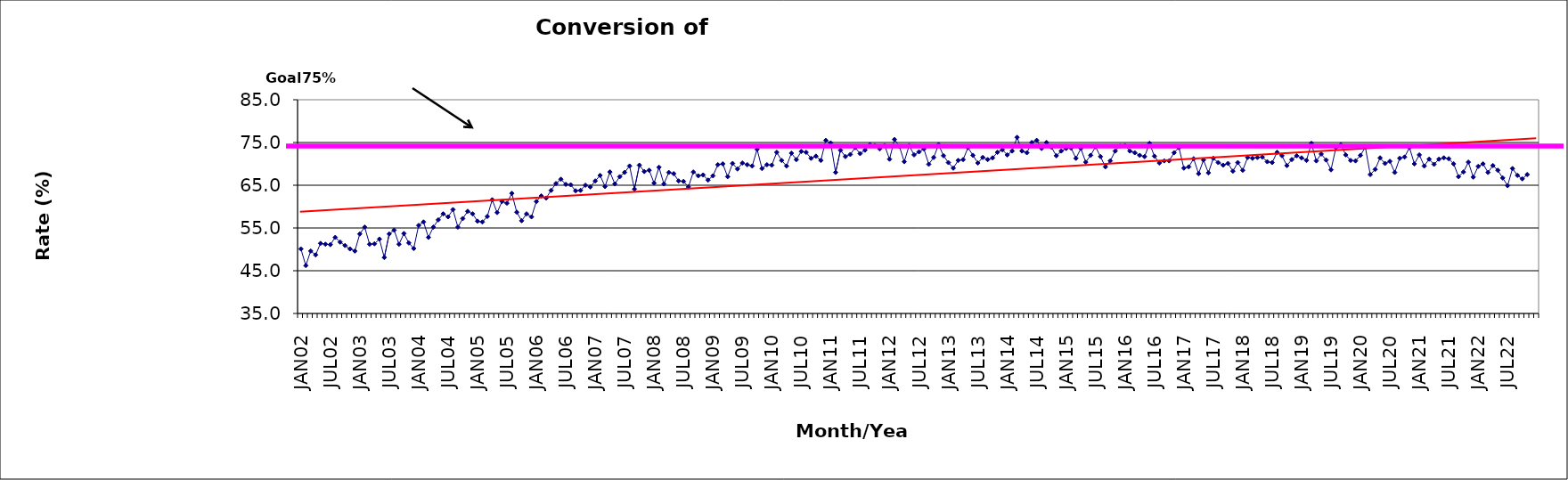
| Category | Series 0 |
|---|---|
| JAN02 | 50.1 |
| FEB02 | 46.2 |
| MAR02 | 49.6 |
| APR02 | 48.7 |
| MAY02 | 51.4 |
| JUN02 | 51.2 |
| JUL02 | 51.1 |
| AUG02 | 52.8 |
| SEP02 | 51.7 |
| OCT02 | 50.9 |
| NOV02 | 50.1 |
| DEC02 | 49.6 |
| JAN03 | 53.6 |
| FEB03 | 55.2 |
| MAR03 | 51.2 |
| APR03 | 51.3 |
| MAY03 | 52.4 |
| JUN03 | 48.1 |
| JUL03 | 53.6 |
| AUG03 | 54.5 |
| SEP03 | 51.2 |
| OCT03 | 53.7 |
| NOV03 | 51.5 |
| DEC03 | 50.2 |
| JAN04 | 55.6 |
| FEB04 | 56.4 |
| MAR04 | 52.8 |
| APR04 | 55.2 |
| MAY04 | 56.9 |
| JUN04 | 58.3 |
| JUL04 | 57.6 |
| AUG04 | 59.3 |
| SEP04 | 55.2 |
| OCT04 | 57.2 |
| NOV04 | 58.9 |
| DEC04 | 58.3 |
| JAN05 | 56.6 |
| FEB05 | 56.4 |
| MAR05 | 57.7 |
| APR05 | 61.6 |
| MAY05 | 58.6 |
| JUN05 | 61.2 |
| JUL05 | 60.8 |
| AUG05 | 63.1 |
| SEP05 | 58.7 |
| OCT05 | 56.7 |
| NOV05 | 58.3 |
| DEC05 | 57.6 |
| JAN06 | 61.2 |
| FEB06 | 62.5 |
| MAR06 | 62 |
| APR06 | 63.8 |
| MAY06 | 65.4 |
| JUN06 | 66.4 |
| JUL06 | 65.2 |
| AUG06 | 65.1 |
| SEP06 | 63.7 |
| OCT06 | 63.8 |
| NOV06 | 65 |
| DEC06 | 64.6 |
| JAN07 | 66 |
| FEB07 | 67.3 |
| MAR07 | 64.7 |
| APR07 | 68.1 |
| MAY07 | 65.3 |
| JUN07 | 67 |
| JUL07 | 68 |
| AUG07 | 69.5 |
| SEP07 | 64.1 |
| OCT07 | 69.7 |
| NOV07 | 68.2 |
| DEC07 | 68.5 |
| JAN08 | 65.5 |
| FEB08 | 69.2 |
| MAR08 | 65.3 |
| APR08 | 68 |
| MAY08 | 67.7 |
| JUN08 | 66 |
| JUL08 | 65.9 |
| AUG08 | 64.6 |
| SEP08 | 68.1 |
| OCT08 | 67.2 |
| NOV08 | 67.4 |
| DEC08 | 66.2 |
| JAN09 | 67.2 |
| FEB09 | 69.8 |
| MAR09 | 70 |
| APR09 | 67 |
| MAY09 | 70.1 |
| JUN09 | 68.8 |
| JUL09 | 70.2 |
| AUG09 | 69.8 |
| SEP09 | 69.5 |
| OCT09 | 73.4 |
| NOV09 | 68.9 |
| DEC09 | 69.8 |
| JAN10 | 69.7 |
| FEB10 | 72.7 |
| MAR10 | 70.8 |
| APR10 | 69.5 |
| MAY10 | 72.5 |
| JUN10 | 71 |
| JUL10 | 72.9 |
| AUG10 | 72.7 |
| SEP10 | 71.3 |
| OCT10 | 71.8 |
| NOV10 | 70.8 |
| DEC10 | 75.5 |
| JAN11 | 74.9 |
| FEB11 | 68 |
| MAR11 | 73.2 |
| APR11 | 71.7 |
| MAY11 | 72.2 |
| JUN11 | 73.8 |
| JUL11 | 72.4 |
| AUG11 | 73.2 |
| SEP11 | 74.5 |
| OCT11 | 74.3 |
| NOV11 | 73.5 |
| DEC11 | 74.3 |
| JAN12 | 71.1 |
| FEB12 | 75.7 |
| MAR12 | 74.1 |
| APR12 | 70.5 |
| MAY12 | 74.3 |
| JUN12 | 72.1 |
| JUL12 | 72.8 |
| AUG12 | 73.5 |
| SEP12 | 69.9 |
| OCT12 | 71.5 |
| NOV12 | 74.5 |
| DEC12 | 71.9 |
| JAN13 | 70.3 |
| FEB13 | 69 |
| MAR13 | 70.8 |
| APR13 | 71 |
| MAY13 | 73.8 |
| JUN13 | 72 |
| JUL13 | 70.2 |
| AUG13 | 71.5 |
| SEP13 | 71 |
| OCT13 | 71.4 |
| NOV13 | 72.7 |
| DEC13 | 73.3 |
| JAN14 | 72.1 |
| FEB14 | 73 |
| MAR14 | 76.2 |
| APR14 | 73 |
| MAY14 | 72.6 |
| JUN14 | 75 |
| JUL14 | 75.5 |
| AUG14 | 73.6 |
| SEP14 | 75 |
| OCT14 | 73.9 |
| NOV14 | 71.9 |
| DEC14 | 73 |
| JAN15 | 73.6 |
| FEB15 | 73.7 |
| MAR15 | 71.3 |
| APR15 | 73.6 |
| MAY15 | 70.4 |
| JUN15 | 72 |
| JUL15 | 74 |
| AUG15 | 71.7 |
| SEP15 | 69.3 |
| OCT15 | 70.7 |
| NOV15 | 73 |
| DEC15 | 74.2 |
| JAN16 | 74.3 |
| FEB16 | 73 |
| MAR16 | 72.6 |
| APR16 | 72 |
| MAY16 | 71.7 |
| JUN16 | 74.8 |
| JUL16 | 71.8 |
| AUG16 | 70.2 |
| SEP16 | 70.7 |
| OCT16 | 70.7 |
| NOV16 | 72.6 |
| DEC16 | 73.8 |
| JAN17 | 69 |
| FEB17 | 69.3 |
| MAR17 | 71.2 |
| APR17 | 67.7 |
| MAY17 | 70.9 |
| JUN17 | 67.9 |
| JUL17 | 71.3 |
| AUG17 | 70.3 |
| SEP17 | 69.7 |
| OCT17 | 70.1 |
| NOV17 | 68.3 |
| DEC17 | 70.3 |
| JAN18 | 68.5 |
| FEB18 | 71.5 |
| MAR18 | 71.3 |
| APR18 | 71.5 |
| MAY18 | 71.6 |
| JUN18 | 70.5 |
| JUL18 | 70.3 |
| AUG18 | 72.7 |
| SEP18 | 71.9 |
| OCT18 | 69.6 |
| NOV18 | 71 |
| DEC18 | 71.9 |
| JAN19 | 71.4 |
| FEB19 | 70.8 |
| MAR19 | 74.8 |
| APR19 | 70.7 |
| MAY19 | 72.3 |
| JUN19 | 70.9 |
| JUL19 | 68.6 |
| AUG19 | 73.8 |
| SEP19 | 74.5 |
| OCT19 | 72.1 |
| NOV19 | 70.8 |
| DEC19 | 70.7 |
| JAN20 | 72 |
| FEB20 | 73.9 |
| MAR20 | 67.5 |
| APR20 | 68.7 |
| MAY20 | 71.4 |
| JUN20 | 70.1 |
| JUL20 | 70.6 |
| AUG20 | 68 |
| SEP20 | 71.3 |
| OCT20 | 71.6 |
| NOV20 | 73.8 |
| DEC20 | 70 |
| JAN21 | 72.1 |
| FEB21 | 69.5 |
| MAR21 | 71.1 |
| APR21 | 69.9 |
| MAY21 | 71.1 |
| JUN21 | 71.4 |
| JUL21 | 71.2 |
| AUG21 | 70 |
| SEP21 | 67 |
| OCT21 | 68.1 |
| NOV21 | 70.4 |
| DEC21 | 66.9 |
| JAN22 | 69.4 |
| FEB22 | 70 |
| MAR22 | 68 |
| APR22 | 69.6 |
| MAY22 | 68.5 |
| JUN22 | 66.7 |
| JUL22 | 64.9 |
| AUG22 | 68.9 |
| SEP22 | 67.3 |
| OCT22 | 66.5 |
| NOV22 | 67.5 |